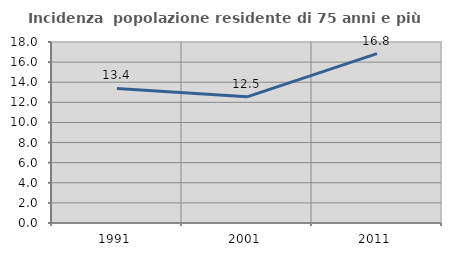
| Category | Incidenza  popolazione residente di 75 anni e più |
|---|---|
| 1991.0 | 13.387 |
| 2001.0 | 12.547 |
| 2011.0 | 16.848 |